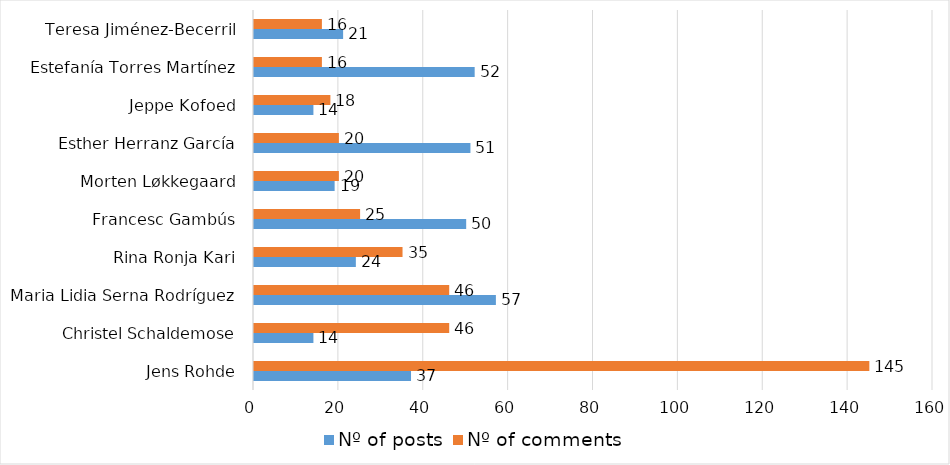
| Category | Nº of posts | Nº of comments |
|---|---|---|
| Jens Rohde | 37 | 145 |
| Christel Schaldemose | 14 | 46 |
| Maria Lidia Serna Rodríguez | 57 | 46 |
| Rina Ronja Kari | 24 | 35 |
| Francesc Gambús | 50 | 25 |
| Morten Løkkegaard | 19 | 20 |
| Esther Herranz García | 51 | 20 |
| Jeppe Kofoed | 14 | 18 |
| Estefanía Torres Martínez | 52 | 16 |
| Teresa Jiménez-Becerril | 21 | 16 |